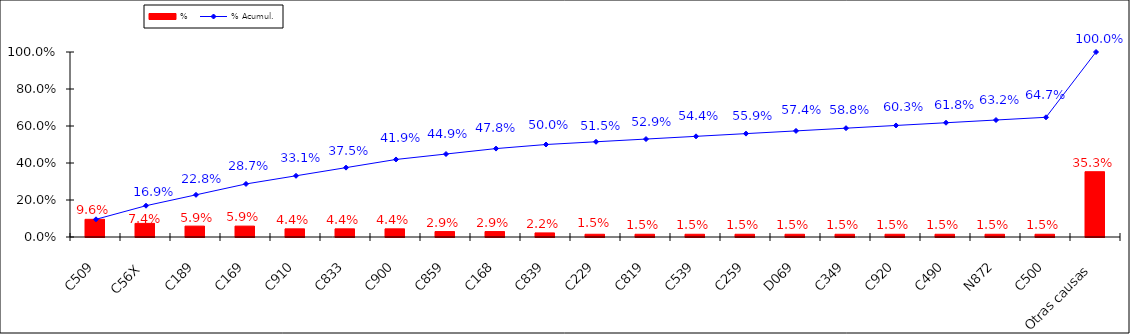
| Category | % |
|---|---|
| C509 | 0.096 |
| C56X | 0.074 |
| C189 | 0.059 |
| C169 | 0.059 |
| C910 | 0.044 |
| C833 | 0.044 |
| C900 | 0.044 |
| C859 | 0.029 |
| C168 | 0.029 |
| C839 | 0.022 |
| C229 | 0.015 |
| C819 | 0.015 |
| C539 | 0.015 |
| C259 | 0.015 |
| D069 | 0.015 |
| C349 | 0.015 |
| C920 | 0.015 |
| C490 | 0.015 |
| N872 | 0.015 |
| C500 | 0.015 |
| Otras causas | 0.353 |